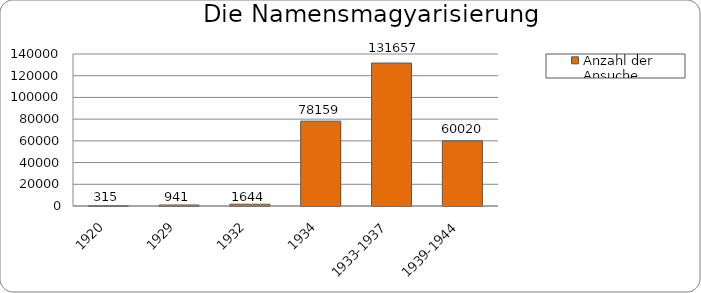
| Category | Anzahl der Ansuche |
|---|---|
| 1920 | 315 |
| 1929 | 941 |
| 1932 | 1644 |
| 1934 | 78159 |
| 1933-1937 | 131657 |
| 1939-1944 | 60020 |